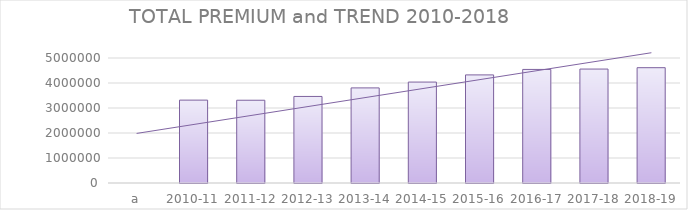
| Category | Series 0 | Series 1 | Series 2 | TOTAL PREMIUMS |
|---|---|---|---|---|
| a |  |  |  | 0 |
| 2010-11 |  |  |  | 3315479 |
| 2011-12 |  |  |  | 3310513 |
| 2012-13 |  |  |  | 3462013 |
| 2013-14 |  |  |  | 3804281 |
| 2014-15 |  |  |  | 4037285 |
| 2015-16 |  |  |  | 4324202 |
| 2016-17 |  |  |  | 4542529 |
| 2017-18 |  |  |  | 4557628 |
| 2018-19 |  |  |  | 4612126 |